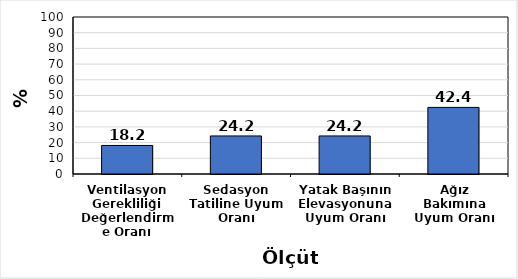
| Category | % |
|---|---|
| Ventilasyon Gerekliliği Değerlendirme Oranı | 18.182 |
| Sedasyon Tatiline Uyum Oranı | 24.242 |
| Yatak Başının Elevasyonuna Uyum Oranı | 24.242 |
| Ağız Bakımına Uyum Oranı | 42.424 |